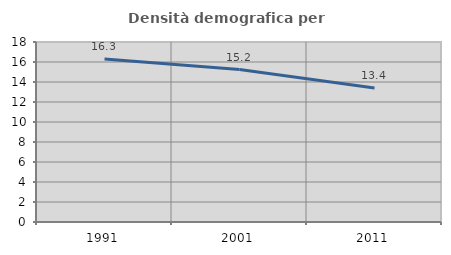
| Category | Densità demografica |
|---|---|
| 1991.0 | 16.302 |
| 2001.0 | 15.243 |
| 2011.0 | 13.395 |